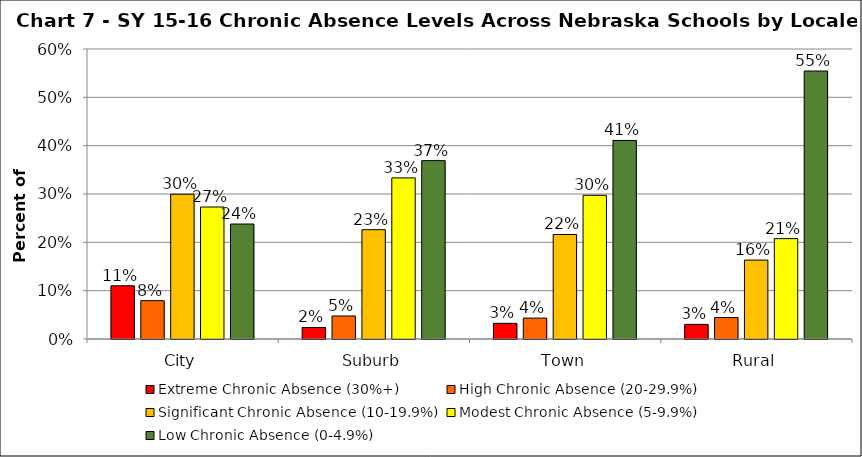
| Category | Extreme Chronic Absence (30%+) | High Chronic Absence (20-29.9%) | Significant Chronic Absence (10-19.9%) | Modest Chronic Absence (5-9.9%) | Low Chronic Absence (0-4.9%) |
|---|---|---|---|---|---|
| 0 | 0.11 | 0.079 | 0.3 | 0.273 | 0.238 |
| 1 | 0.024 | 0.048 | 0.226 | 0.333 | 0.369 |
| 2 | 0.032 | 0.043 | 0.216 | 0.297 | 0.411 |
| 3 | 0.03 | 0.044 | 0.163 | 0.208 | 0.554 |